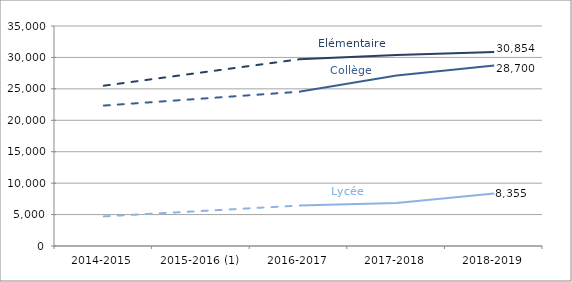
| Category | Elémentaire | Collège | Lycée |
|---|---|---|---|
| 2014-2015 | 25504 | 22340 | 4708 |
| 2015-2016 (1) | 27602.5 | 23440 | 5570 |
| 2016-2017 | 29701 | 24540 | 6432 |
| 2017-2018 | 30385 | 27110 | 6855 |
| 2018-2019 | 30854.335 | 28699.66 | 8355 |